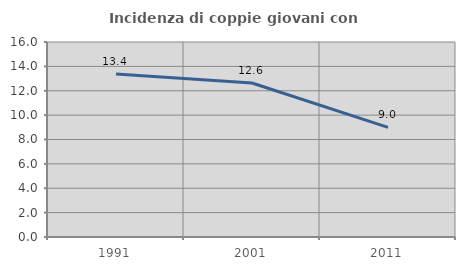
| Category | Incidenza di coppie giovani con figli |
|---|---|
| 1991.0 | 13.37 |
| 2001.0 | 12.637 |
| 2011.0 | 8.994 |